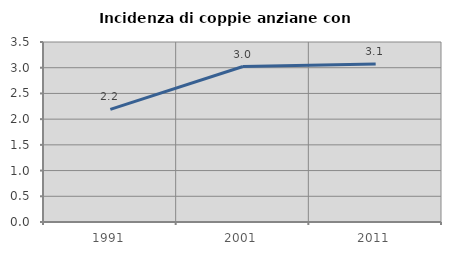
| Category | Incidenza di coppie anziane con figli |
|---|---|
| 1991.0 | 2.191 |
| 2001.0 | 3.023 |
| 2011.0 | 3.072 |